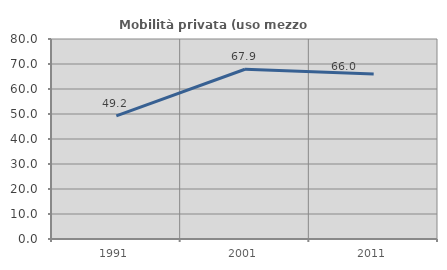
| Category | Mobilità privata (uso mezzo privato) |
|---|---|
| 1991.0 | 49.249 |
| 2001.0 | 67.901 |
| 2011.0 | 66.029 |